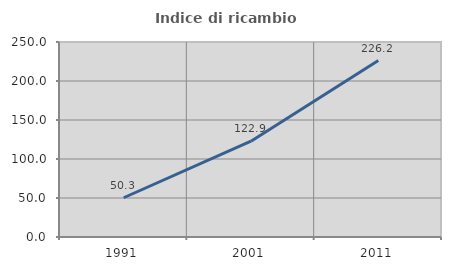
| Category | Indice di ricambio occupazionale  |
|---|---|
| 1991.0 | 50.318 |
| 2001.0 | 122.881 |
| 2011.0 | 226.214 |